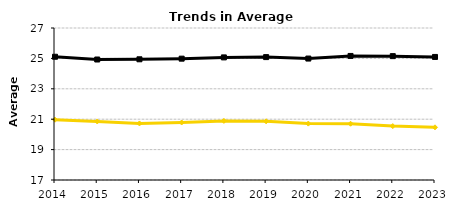
| Category |  Undergraduate  |  Graduate |
|---|---|---|
| 2014.0 | 20.967 | 25.108 |
| 2015.0 | 20.852 | 24.927 |
| 2016.0 | 20.721 | 24.941 |
| 2017.0 | 20.783 | 24.982 |
| 2018.0 | 20.889 | 25.066 |
| 2019.0 | 20.861 | 25.085 |
| 2020.0 | 20.711 | 24.989 |
| 2021.0 | 20.703 | 25.161 |
| 2022.0 | 20.546 | 25.149 |
| 2023.0 | 20.465 | 25.095 |